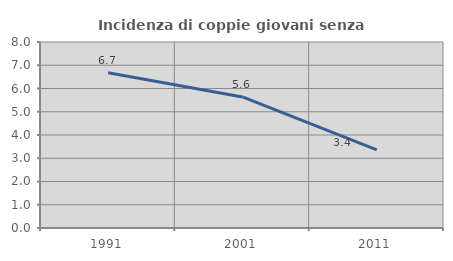
| Category | Incidenza di coppie giovani senza figli |
|---|---|
| 1991.0 | 6.676 |
| 2001.0 | 5.636 |
| 2011.0 | 3.36 |